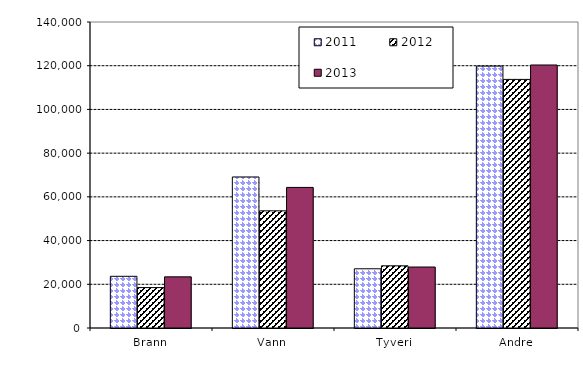
| Category | 2011 | 2012 | 2013 |
|---|---|---|---|
| Brann | 23654 | 18489.054 | 23401.955 |
| Vann | 69101 | 53604.461 | 64323.581 |
| Tyveri | 27088 | 28444.781 | 27899.023 |
| Andre | 119816 | 113738.518 | 120329.909 |